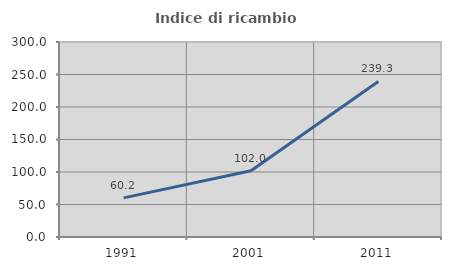
| Category | Indice di ricambio occupazionale  |
|---|---|
| 1991.0 | 60.227 |
| 2001.0 | 102.013 |
| 2011.0 | 239.286 |